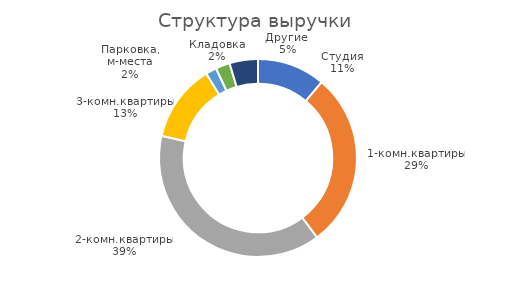
| Category | Series 0 |
|---|---|
| Студия | 81322.5 |
| 1-комн.квартиры | 210240 |
| 2-комн.квартиры | 283800 |
| 3-комн.квартиры | 92565 |
| Парковка, м-места | 13062.5 |
| Кладовка | 16981.25 |
| Другие  | 33962.5 |